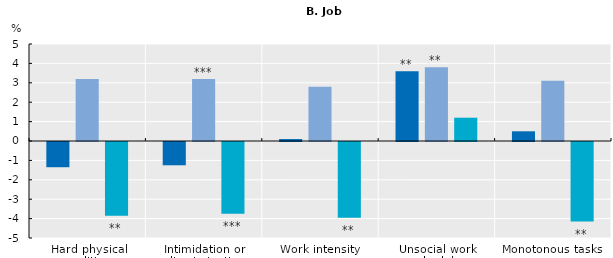
| Category | Mixed voice (dircect and representative voice) | Representative voice (union and non-union) | Direct voice |
|---|---|---|---|
| Hard physical conditions | -1.3 | 3.2 | -3.8 |
| Intimidation or discrimination | -1.2 | 3.2 | -3.7 |
| Work intensity | 0.1 | 2.8 | -3.9 |
| Unsocial work schedule  | 3.6 | 3.8 | 1.2 |
| Monotonous tasks | 0.5 | 3.1 | -4.1 |